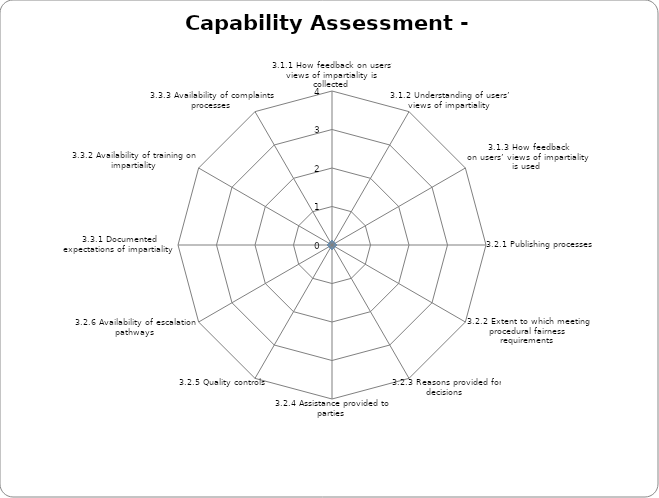
| Category | Series 0 |
|---|---|
| 3.1.1 How feedback on users’ views of impartiality is collected | 0 |
| 3.1.2 Understanding of users’ views of impartiality  | 0 |
| 3.1.3 How feedback on users’ views of impartiality is used  | 0 |
| 3.2.1 Publishing processes  | 0 |
| 3.2.2 Extent to which meeting procedural fairness requirements  | 0 |
| 3.2.3 Reasons provided for decisions  | 0 |
| 3.2.4 Assistance provided to parties  | 0 |
| 3.2.5 Quality controls | 0 |
| 3.2.6 Availability of escalation pathways  | 0 |
| 3.3.1 Documented expectations of impartiality  | 0 |
| 3.3.2 Availability of training on impartiality | 0 |
| 3.3.3 Availability of complaints processes  | 0 |